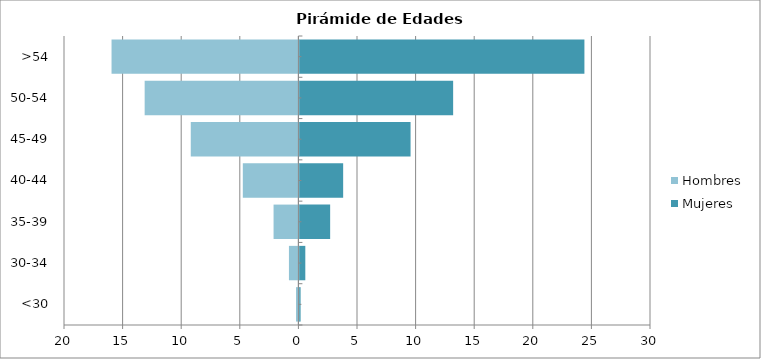
| Category | Mujeres | Hombres |
|---|---|---|
| <30 | 0.101 | -0.202 |
| 30-34 | 0.505 | -0.807 |
| 35-39 | 2.624 | -2.119 |
| 40-44 | 3.734 | -4.743 |
| 45-49 | 9.485 | -9.183 |
| 50-54 | 13.118 | -13.118 |
| >54 | 24.319 | -15.943 |